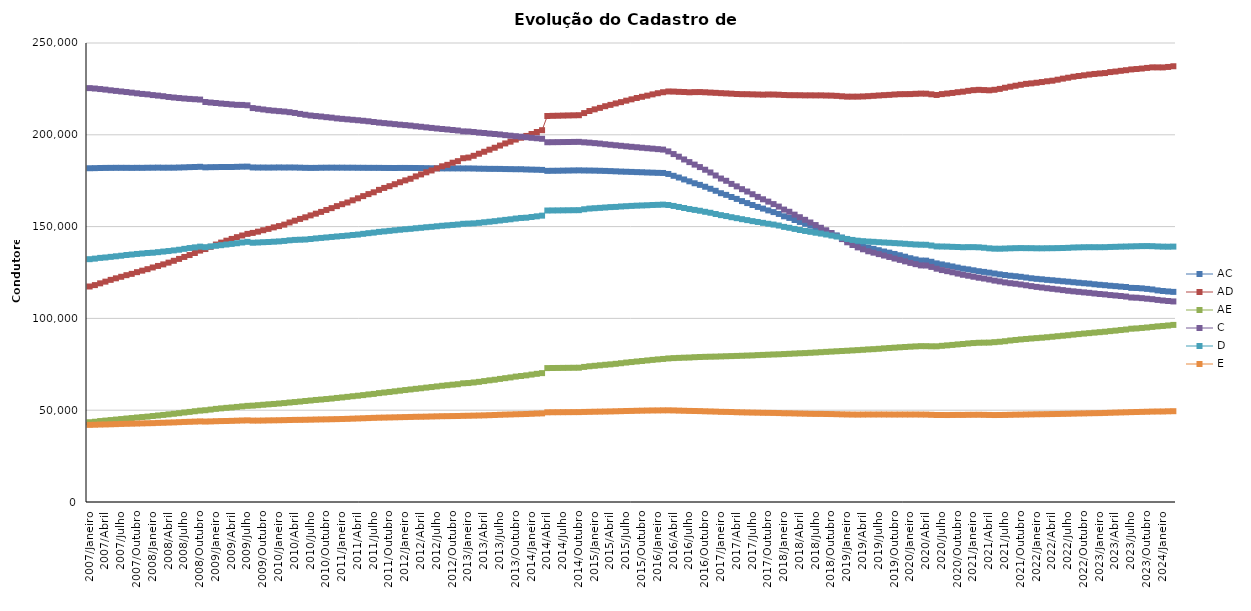
| Category | AC | AD | AE | C | D | E |
|---|---|---|---|---|---|---|
| 2007/Janeiro | 181791 | 117376 | 43453 | 225424 | 132256 | 42010 |
| 2007/Fevereiro | 181839 | 118134 | 43717 | 225208 | 132560 | 42089 |
| 2007/Março | 181925 | 119096 | 44086 | 224917 | 132959 | 42192 |
| 2007/Abril | 181961 | 120021 | 44347 | 224613 | 133182 | 42250 |
| 2007/Maio | 181984 | 120992 | 44626 | 224229 | 133516 | 42326 |
| 2007/Junho | 182009 | 121833 | 44897 | 223913 | 133828 | 42416 |
| 2007/Julho | 182009 | 122665 | 45181 | 223599 | 134142 | 42523 |
| 2007/Agosto | 182000 | 123541 | 45473 | 223293 | 134528 | 42603 |
| 2007/Setembro | 181978 | 124253 | 45733 | 222949 | 134795 | 42660 |
| 2007/Outubro | 182008 | 125189 | 46013 | 222604 | 135104 | 42734 |
| 2007/Novembro | 181995 | 126001 | 46273 | 222266 | 135349 | 42818 |
| 2007/Dezembro | 182056 | 126816 | 46507 | 222042 | 135637 | 42899 |
| 2008/Janeiro | 182073 | 127731 | 46824 | 221631 | 135771 | 42952 |
| 2008/Fevereiro | 182116 | 128569 | 47117 | 221354 | 136076 | 43084 |
| 2008/Março | 182071 | 129420 | 47427 | 221019 | 136401 | 43154 |
| 2008/Abril | 182081 | 130372 | 47736 | 220604 | 136691 | 43262 |
| 2008/Maio | 182087 | 131372 | 48048 | 220294 | 137035 | 43349 |
| 2008/Junho | 182175 | 132407 | 48370 | 220026 | 137401 | 43477 |
| 2008/Julho | 182269 | 133465 | 48748 | 219774 | 137887 | 43606 |
| 2008/Agosto | 182384 | 134505 | 49065 | 219550 | 138324 | 43692 |
| 2008/Setembro | 182471 | 135616 | 49429 | 219371 | 138683 | 43790 |
| 2008/Outubro | 182576 | 136929 | 49766 | 219184 | 139091 | 43906 |
| 2008/Novembro | 182274 | 137775 | 49979 | 217852 | 138794 | 43811 |
| 2008/Dezembro | 182366 | 138975 | 50343 | 217562 | 139201 | 43888 |
| 2009/Janeiro | 182404 | 140218 | 50722 | 217307 | 139551 | 43996 |
| 2009/Fevereiro | 182463 | 141290 | 51008 | 217026 | 139874 | 44078 |
| 2009/Março | 182474 | 142332 | 51281 | 216808 | 140244 | 44118 |
| 2009/Abril | 182468 | 143287 | 51506 | 216556 | 140571 | 44197 |
| 2009/Maio | 182551 | 144247 | 51790 | 216311 | 140930 | 44293 |
| 2009/Junho | 182634 | 145151 | 52084 | 216271 | 141344 | 44397 |
| 2009/Julho | 182676 | 146035 | 52364 | 216066 | 141694 | 44476 |
| 2009/Agosto | 182216 | 146561 | 52483 | 214560 | 141208 | 44328 |
| 2009/Setembro | 182163 | 147249 | 52722 | 214181 | 141347 | 44333 |
| 2009/Outubro | 182163 | 148023 | 52964 | 213797 | 141502 | 44375 |
| 2009/Novembro | 182139 | 148757 | 53200 | 213405 | 141622 | 44449 |
| 2009/Dezembro | 182163 | 149577 | 53398 | 213133 | 141775 | 44481 |
| 2010/Janeiro | 182212 | 150280 | 53639 | 212879 | 141942 | 44532 |
| 2010/Fevereiro | 182173 | 151078 | 53883 | 212655 | 142190 | 44589 |
| 2010/Março | 182201 | 152257 | 54184 | 212315 | 142538 | 44673 |
| 2010/Abril | 182175 | 153222 | 54437 | 211906 | 142757 | 44718 |
| 2010/Maio | 182097 | 154180 | 54708 | 211380 | 142860 | 44741 |
| 2010/Junho | 182005 | 155065 | 55002 | 210928 | 142963 | 44782 |
| 2010/Julho | 181961 | 156107 | 55287 | 210500 | 143252 | 44844 |
| 2010/Agosto | 181983 | 157039 | 55583 | 210210 | 143565 | 44925 |
| 2010/Setembro | 182057 | 158008 | 55808 | 209949 | 143830 | 44981 |
| 2010/Outubro | 182080 | 159060 | 56079 | 209607 | 144087 | 45025 |
| 2010/Novembro | 182105 | 160060 | 56344 | 209339 | 144357 | 45082 |
| 2010/Dezembro | 182087 | 161154 | 56680 | 208937 | 144619 | 45145 |
| 2011/Janeiro | 182098 | 162207 | 56964 | 208683 | 144860 | 45223 |
| 2011/Fevereiro | 182069 | 163127 | 57270 | 208429 | 145109 | 45289 |
| 2011/Março | 182077 | 164318 | 57608 | 208173 | 145440 | 45401 |
| 2011/Abril | 182034 | 165403 | 57886 | 207928 | 145667 | 45504 |
| 2011/Maio | 182021 | 166606 | 58216 | 207643 | 146060 | 45612 |
| 2011/Junho | 181996 | 167704 | 58586 | 207357 | 146418 | 45718 |
| 2011/Julho | 181994 | 168681 | 58870 | 206981 | 146722 | 45826 |
| 2011/Agosto | 181987 | 170006 | 59304 | 206637 | 147129 | 45922 |
| 2011/Setembro | 181949 | 171057 | 59616 | 206367 | 147394 | 45979 |
| 2011/Outubro | 181936 | 172022 | 59936 | 206093 | 147685 | 46048 |
| 2011/Novembro | 181905 | 173086 | 60281 | 205807 | 147998 | 46119 |
| 2011/Dezembro | 181951 | 174170 | 60626 | 205507 | 148292 | 46187 |
| 2012/Janeiro | 181953 | 175178 | 60978 | 205279 | 148570 | 46261 |
| 2012/Fevereiro | 181935 | 176051 | 61304 | 205013 | 148783 | 46322 |
| 2012/Março | 181903 | 177353 | 61645 | 204660 | 149096 | 46408 |
| 2012/Abril | 181888 | 178420 | 61945 | 204374 | 149348 | 46437 |
| 2012/Maio | 181830 | 179566 | 62293 | 204052 | 149654 | 46497 |
| 2012/Junho | 181779 | 180577 | 62615 | 203746 | 149869 | 46581 |
| 2012/Julho | 181756 | 181697 | 62949 | 203443 | 150168 | 46652 |
| 2012/Agosto | 181702 | 182840 | 63311 | 203166 | 150453 | 46729 |
| 2012/Setembro | 181708 | 183635 | 63596 | 202910 | 150676 | 46757 |
| 2012/Outubro | 181702 | 184794 | 63897 | 202604 | 150909 | 46809 |
| 2012/Novembro | 181705 | 185645 | 64144 | 202345 | 151135 | 46846 |
| 2012/Dezembro | 181679 | 187243 | 64653 | 201854 | 151526 | 46931 |
| 2013/Janeiro | 181686 | 187599 | 64789 | 201784 | 151630 | 46976 |
| 2013/Fevereiro | 181638 | 188557 | 65105 | 201526 | 151760 | 47046 |
| 2013/Março | 181549 | 189693 | 65441 | 201190 | 152043 | 47110 |
| 2013/Abril | 181508 | 190765 | 65856 | 200985 | 152359 | 47189 |
| 2013/Maio | 181447 | 191901 | 66266 | 200666 | 152651 | 47286 |
| 2013/Junho | 181443 | 192950 | 66597 | 200440 | 152956 | 47380 |
| 2013/Julho | 181416 | 194135 | 67049 | 200169 | 153325 | 47501 |
| 2013/Agosto | 181345 | 195303 | 67444 | 199811 | 153665 | 47614 |
| 2013/Setembro | 181303 | 196252 | 67841 | 199519 | 153977 | 47686 |
| 2013/Outubro | 181252 | 197405 | 68303 | 199247 | 154386 | 47792 |
| 2013/Novembro | 181249 | 198400 | 68638 | 198971 | 154707 | 47856 |
| 2013/Dezembro | 181118 | 199380 | 68971 | 198677 | 154848 | 47944 |
| 2014/Janeiro | 181033 | 200424 | 69406 | 198366 | 155238 | 48055 |
| 2014/Fevereiro | 180968 | 201512 | 69815 | 198114 | 155593 | 48191 |
| 2014/Março | 180880 | 202509 | 70193 | 197834 | 155965 | 48263 |
| 2014/Abril | 180364 | 210235 | 72935 | 195944 | 158762 | 48857 |
| 2014/Maio | 180405 | 210330 | 72975 | 195977 | 158796 | 48887 |
| 2014/Junho | 180430 | 210390 | 73009 | 196010 | 158822 | 48903 |
| 2014/Julho | 180487 | 210477 | 73043 | 196049 | 158860 | 48919 |
| 2014/Agosto | 180536 | 210543 | 73078 | 196081 | 158896 | 48937 |
| 2014/Setembro | 180591 | 210604 | 73108 | 196122 | 158927 | 48954 |
| 2014/Outubro | 180632 | 210672 | 73138 | 196155 | 158953 | 48967 |
| 2014/Novembro | 180565 | 211835 | 73574 | 195906 | 159439 | 49048 |
| 2014/Dezembro | 180531 | 212951 | 73930 | 195716 | 159822 | 49110 |
| 2015/Janeiro | 180486 | 213858 | 74184 | 195460 | 160013 | 49172 |
| 2015/Fevereiro | 180404 | 214665 | 74462 | 195207 | 160198 | 49222 |
| 2015/Março | 180326 | 215570 | 74739 | 194864 | 160399 | 49275 |
| 2015/Abril | 180227 | 216293 | 74977 | 194572 | 160622 | 49330 |
| 2015/Maio | 180104 | 217086 | 75268 | 194293 | 160720 | 49403 |
| 2015/Junho | 179966 | 217793 | 75588 | 194015 | 160959 | 49480 |
| 2015/Julho | 179876 | 218587 | 75941 | 193731 | 161110 | 49560 |
| 2015/Agosto | 179783 | 219311 | 76231 | 193464 | 161272 | 49605 |
| 2015/Setembro | 179677 | 220036 | 76533 | 193218 | 161407 | 49691 |
| 2015/Outubro | 179598 | 220700 | 76805 | 192949 | 161511 | 49750 |
| 2015/Novembro | 179467 | 221326 | 77104 | 192694 | 161622 | 49809 |
| 2015/Dezembro | 179382 | 222018 | 77403 | 192460 | 161781 | 49859 |
| 2016/Janeiro | 179274 | 222641 | 77668 | 192193 | 161856 | 49873 |
| 2016/Fevereiro | 179212 | 223188 | 77914 | 191944 | 161973 | 49916 |
| 2016/Março | 178667 | 223596 | 78196 | 190953 | 161778 | 49928 |
| 2016/Abril | 177666 | 223546 | 78380 | 189507 | 161258 | 49878 |
| 2016/Maio | 176722 | 223401 | 78493 | 188077 | 160697 | 49774 |
| 2016/Junho | 175678 | 223304 | 78604 | 186568 | 160134 | 49697 |
| 2016/Julho | 174654 | 223145 | 78683 | 185128 | 159563 | 49612 |
| 2016/Agosto | 173604 | 223255 | 78861 | 183763 | 159095 | 49568 |
| 2016/Setembro | 172729 | 223283 | 78980 | 182416 | 158634 | 49505 |
| 2016/Outubro | 171711 | 223160 | 79064 | 180977 | 158061 | 49400 |
| 2016/Novembro | 170599 | 222998 | 79139 | 179478 | 157535 | 49320 |
| 2016/Dezembro | 169501 | 222853 | 79191 | 177839 | 156857 | 49238 |
| 2017/Janeiro | 168179 | 222686 | 79293 | 176184 | 156236 | 49110 |
| 2017/Fevereiro | 167283 | 222551 | 79390 | 174950 | 155738 | 49075 |
| 2017/Março | 166135 | 222409 | 79476 | 173256 | 155110 | 49015 |
| 2017/Abril | 165090 | 222233 | 79560 | 171906 | 154594 | 48903 |
| 2017/Maio | 163889 | 222135 | 79654 | 170386 | 154031 | 48833 |
| 2017/Junho | 162812 | 222115 | 79759 | 169097 | 153529 | 48765 |
| 2017/Julho | 161767 | 222027 | 79843 | 167624 | 152979 | 48703 |
| 2017/Agosto | 160717 | 221948 | 80010 | 166178 | 152526 | 48654 |
| 2017/Setembro | 159810 | 221859 | 80113 | 164871 | 152041 | 48585 |
| 2017/Outubro | 158820 | 221958 | 80235 | 163603 | 151543 | 48553 |
| 2017/Novembro | 157906 | 221932 | 80358 | 162260 | 151116 | 48512 |
| 2017/Dezembro | 156891 | 221834 | 80439 | 160899 | 150589 | 48448 |
| 2018/Janeiro | 155615 | 221694 | 80587 | 159268 | 149847 | 48335 |
| 2018/Fevereiro | 154729 | 221587 | 80715 | 158076 | 149353 | 48317 |
| 2018/Março | 153598 | 221572 | 80861 | 156507 | 148739 | 48233 |
| 2018/Abril | 152541 | 221546 | 81006 | 155109 | 148143 | 48160 |
| 2018/Maio | 151528 | 221480 | 81105 | 153691 | 147628 | 48094 |
| 2018/Junho | 150524 | 221494 | 81264 | 152233 | 147149 | 48020 |
| 2018/Julho | 149443 | 221463 | 81417 | 150841 | 146662 | 47980 |
| 2018/Agosto | 148308 | 221477 | 81599 | 149362 | 146203 | 47982 |
| 2018/Setembro | 147406 | 221389 | 81768 | 148007 | 145701 | 47944 |
| 2018/Outubro | 146313 | 221345 | 81930 | 146512 | 145128 | 47897 |
| 2018/Novembro | 145187 | 221203 | 82093 | 144945 | 144586 | 47822 |
| 2018/Dezembro | 143989 | 220978 | 82243 | 143189 | 143931 | 47741 |
| 2019/Janeiro | 142635 | 220777 | 82384 | 141458 | 143281 | 47677 |
| 2019/Fevereiro | 141504 | 220780 | 82563 | 139983 | 142740 | 47625 |
| 2019/Março | 140402 | 220790 | 82727 | 138685 | 142334 | 47597 |
| 2019/Abril | 139440 | 220892 | 82902 | 137643 | 142066 | 47627 |
| 2019/Maio | 138544 | 221041 | 83113 | 136559 | 141846 | 47658 |
| 2019/Junho | 137880 | 221224 | 83250 | 135806 | 141711 | 47650 |
| 2019/Julho | 137152 | 221421 | 83442 | 135013 | 141510 | 47666 |
| 2019/Agosto | 136424 | 221599 | 83684 | 134241 | 141347 | 47657 |
| 2019/Setembro | 135813 | 221742 | 83890 | 133458 | 141191 | 47642 |
| 2019/Outubro | 135104 | 221959 | 84057 | 132606 | 141016 | 47627 |
| 2019/Novembro | 134396 | 222123 | 84255 | 131869 | 140857 | 47641 |
| 2019/Dezembro | 133617 | 222153 | 84428 | 131068 | 140653 | 47646 |
| 2020/Janeiro | 132779 | 222179 | 84602 | 130226 | 140437 | 47644 |
| 2020/Fevereiro | 132128 | 222326 | 84751 | 129544 | 140250 | 47654 |
| 2020/Março | 131503 | 222437 | 84892 | 128852 | 140146 | 47624 |
| 2020/Abril | 131473 | 222397 | 84873 | 128799 | 140100 | 47604 |
| 2020/Maio | 130840 | 222049 | 84804 | 128040 | 139695 | 47489 |
| 2020/Junho | 129964 | 221693 | 84793 | 127070 | 139207 | 47384 |
| 2020/Julho | 129399 | 222164 | 85065 | 126325 | 139153 | 47375 |
| 2020/Agosto | 128869 | 222478 | 85310 | 125727 | 139103 | 47363 |
| 2020/Setembro | 128295 | 222791 | 85554 | 125120 | 138972 | 47411 |
| 2020/Outubro | 127688 | 223199 | 85827 | 124415 | 138891 | 47433 |
| 2020/Novembro | 127078 | 223493 | 86068 | 123757 | 138753 | 47426 |
| 2020/Dezembro | 126708 | 223949 | 86344 | 123249 | 138824 | 47481 |
| 2021/Janeiro | 126197 | 224312 | 86570 | 122699 | 138820 | 47498 |
| 2021/Fevereiro | 125696 | 224493 | 86728 | 122151 | 138725 | 47520 |
| 2021/Março | 125327 | 224363 | 86780 | 121717 | 138487 | 47469 |
| 2021/Abril | 124920 | 224226 | 86824 | 121195 | 138169 | 47407 |
| 2021/Maio | 124454 | 224520 | 87056 | 120584 | 137978 | 47363 |
| 2021/Junho | 123992 | 225005 | 87277 | 120131 | 137952 | 47385 |
| 2021/Julho | 123618 | 225631 | 87567 | 119593 | 138044 | 47426 |
| 2021/Agosto | 123242 | 226199 | 87968 | 119170 | 138171 | 47491 |
| 2021/Setembro | 122976 | 226731 | 88255 | 118871 | 138253 | 47563 |
| 2021/Outubro | 122653 | 227240 | 88558 | 118464 | 138307 | 47599 |
| 2021/Novembro | 122257 | 227743 | 88800 | 118038 | 138263 | 47672 |
| 2021/Dezembro | 121852 | 228010 | 89053 | 117576 | 138252 | 47721 |
| 2022/Janeiro | 121544 | 228349 | 89269 | 117160 | 138184 | 47784 |
| 2022/Fevereiro | 121299 | 228733 | 89487 | 116822 | 138174 | 47810 |
| 2022/Março | 120991 | 229148 | 89738 | 116438 | 138214 | 47852 |
| 2022/Abril | 120771 | 229466 | 90008 | 116115 | 138236 | 47899 |
| 2022/Maio | 120494 | 230012 | 90299 | 115776 | 138289 | 47947 |
| 2022/Junho | 120227 | 230595 | 90568 | 115417 | 138337 | 48004 |
| 2022/Julho | 119986 | 231091 | 90833 | 115048 | 138438 | 48048 |
| 2022/Agosto | 119695 | 231632 | 91163 | 114741 | 138613 | 48138 |
| 2022/Setembro | 119423 | 232023 | 91450 | 114465 | 138682 | 48208 |
| 2022/Outubro | 119162 | 232402 | 91735 | 114175 | 138762 | 48252 |
| 2022/Novembro | 118933 | 232817 | 91981 | 113924 | 138791 | 48330 |
| 2022/Dezembro | 118588 | 233137 | 92255 | 113587 | 138782 | 48383 |
| 2023/Janeiro | 118307 | 233409 | 92509 | 113298 | 138770 | 48424 |
| 2023/Fevereiro | 118084 | 233628 | 92738 | 113068 | 138793 | 48502 |
| 2023/Março | 117785 | 234169 | 93072 | 112712 | 138911 | 48608 |
| 2023/Abril | 117571 | 234451 | 93335 | 112476 | 138978 | 48699 |
| 2023/Maio | 117305 | 234853 | 93661 | 112200 | 139082 | 48787 |
| 2023/Junho | 117089 | 235182 | 93933 | 111895 | 139140 | 48861 |
| 2023/Julho | 116622 | 235605 | 94394 | 111370 | 139228 | 48957 |
| 2023/Agosto | 116568 | 235822 | 94536 | 111269 | 139299 | 49012 |
| 2023/Setembro | 116362 | 236092 | 94798 | 111024 | 139374 | 49089 |
| 2023/Outubro | 116074 | 236427 | 95041 | 110732 | 139395 | 49161 |
| 2023/Novembro | 115762 | 236737 | 95360 | 110466 | 139338 | 49254 |
| 2023/Dezembro | 115252 | 236718 | 95663 | 110069 | 139184 | 49289 |
| 2024/Janeiro | 114916 | 236698 | 95881 | 109748 | 139084 | 49302 |
| 2024/Fevereiro | 114675 | 236952 | 96141 | 109473 | 139051 | 49398 |
| 2024/Março | 114451 | 237334 | 96456 | 109233 | 139107 | 49454 |